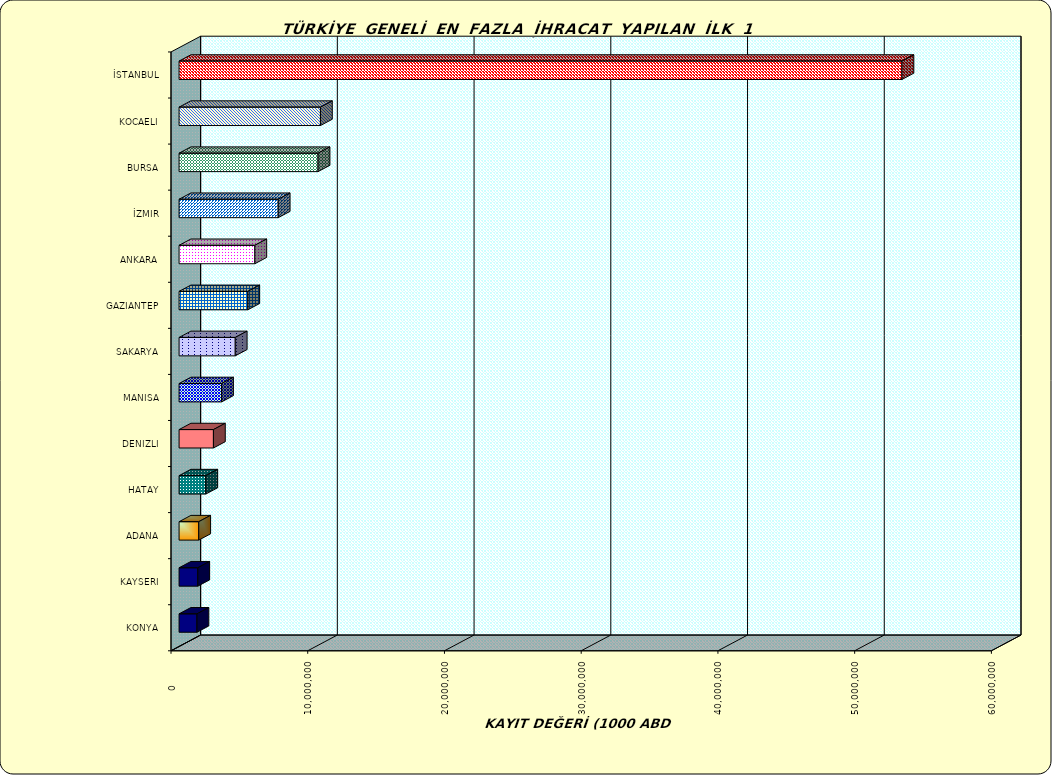
| Category | Series 0 |
|---|---|
| İSTANBUL | 52868471.889 |
| KOCAELI | 10339211.786 |
| BURSA | 10165796.883 |
| İZMIR | 7249644.307 |
| ANKARA | 5540406.99 |
| GAZIANTEP | 5026044.342 |
| SAKARYA | 4109113.854 |
| MANISA | 3106188.248 |
| DENIZLI | 2512600.188 |
| HATAY | 1954506.513 |
| ADANA | 1438018.13 |
| KAYSERI | 1367998.726 |
| KONYA | 1307663.788 |